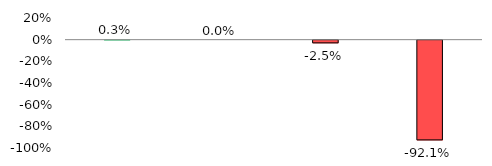
| Category | Series 1 |
|---|---|
| Advances | 0.003 |
| Performing Advances | 0 |
| Classified Advances | -0.025 |
| Non Fund Base Advances | -0.921 |